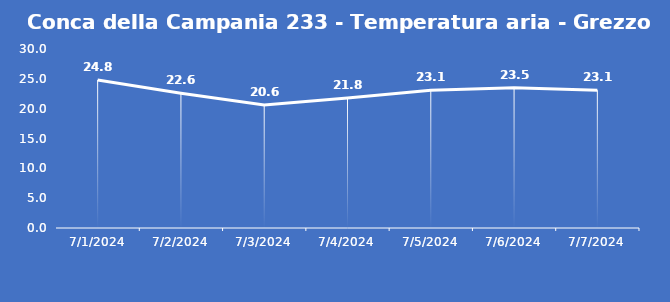
| Category | Conca della Campania 233 - Temperatura aria - Grezzo (°C) |
|---|---|
| 7/1/24 | 24.8 |
| 7/2/24 | 22.6 |
| 7/3/24 | 20.6 |
| 7/4/24 | 21.8 |
| 7/5/24 | 23.1 |
| 7/6/24 | 23.5 |
| 7/7/24 | 23.1 |